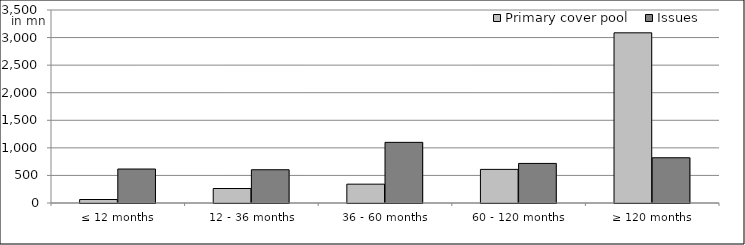
| Category | Primary cover pool | Issues |
|---|---|---|
| ≤ 12 months | 63387682.28 | 616030554.481 |
| 12 - 36 months | 262934170.81 | 603000000 |
| 36 - 60 months | 341693139.419 | 1099721378.63 |
| 60 - 120 months | 609669868.427 | 717650000 |
| ≥ 120 months | 3086259589.418 | 820585464.34 |